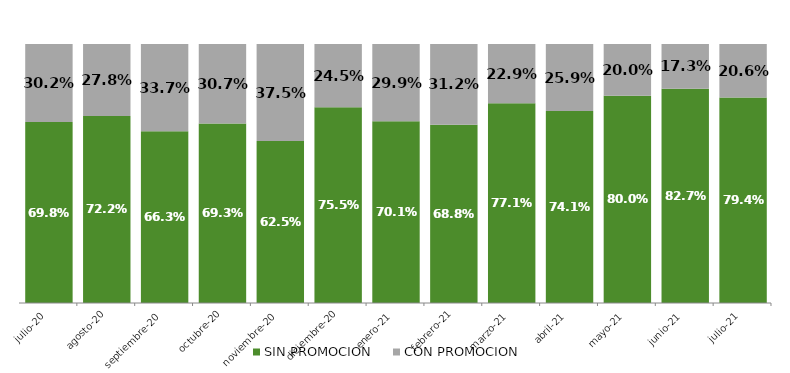
| Category | SIN PROMOCION   | CON PROMOCION   |
|---|---|---|
| 2020-07-01 | 0.698 | 0.302 |
| 2020-08-01 | 0.722 | 0.278 |
| 2020-09-01 | 0.663 | 0.337 |
| 2020-10-01 | 0.693 | 0.307 |
| 2020-11-01 | 0.625 | 0.375 |
| 2020-12-01 | 0.755 | 0.245 |
| 2021-01-01 | 0.701 | 0.299 |
| 2021-02-01 | 0.688 | 0.312 |
| 2021-03-01 | 0.771 | 0.229 |
| 2021-04-01 | 0.741 | 0.259 |
| 2021-05-01 | 0.8 | 0.2 |
| 2021-06-01 | 0.827 | 0.173 |
| 2021-07-01 | 0.794 | 0.206 |